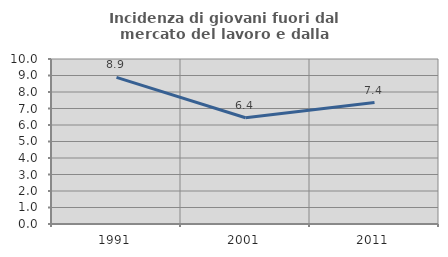
| Category | Incidenza di giovani fuori dal mercato del lavoro e dalla formazione  |
|---|---|
| 1991.0 | 8.889 |
| 2001.0 | 6.443 |
| 2011.0 | 7.362 |